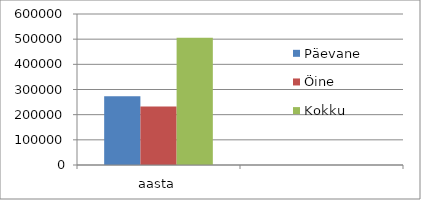
| Category | Päevane | Öine | Kokku |
|---|---|---|---|
| aasta | 273437.181 | 232270.774 | 505707.955 |